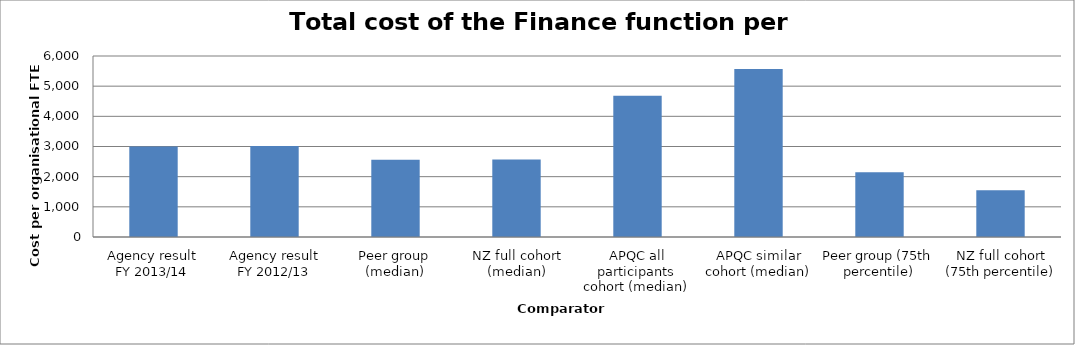
| Category | Result |
|---|---|
| Agency result
FY 2013/14 | 3001.605 |
| Agency result
FY 2012/13 | 3016.564 |
| Peer group (median) | 2563.671 |
| NZ full cohort (median) | 2569.26 |
| APQC all participants cohort (median) | 4679 |
| APQC similar cohort (median) | 5571 |
| Peer group (75th percentile) | 2144.171 |
| NZ full cohort (75th percentile) | 1551.346 |